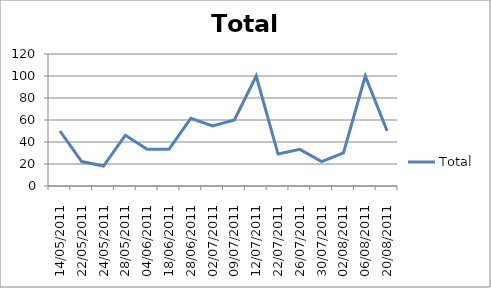
| Category | Total |
|---|---|
| 14/05/2011 | 50 |
| 22/05/2011 | 22.222 |
| 24/05/2011 | 18.182 |
| 28/05/2011 | 46.154 |
| 04/06/2011 | 33.333 |
| 18/06/2011 | 33.333 |
| 28/06/2011 | 61.538 |
| 02/07/2011 | 54.545 |
| 09/07/2011 | 60 |
| 12/07/2011 | 100 |
| 22/07/2011 | 29.032 |
| 26/07/2011 | 33.333 |
| 30/07/2011 | 22.222 |
| 02/08/2011 | 30 |
| 06/08/2011 | 100 |
| 20/08/2011 | 50 |